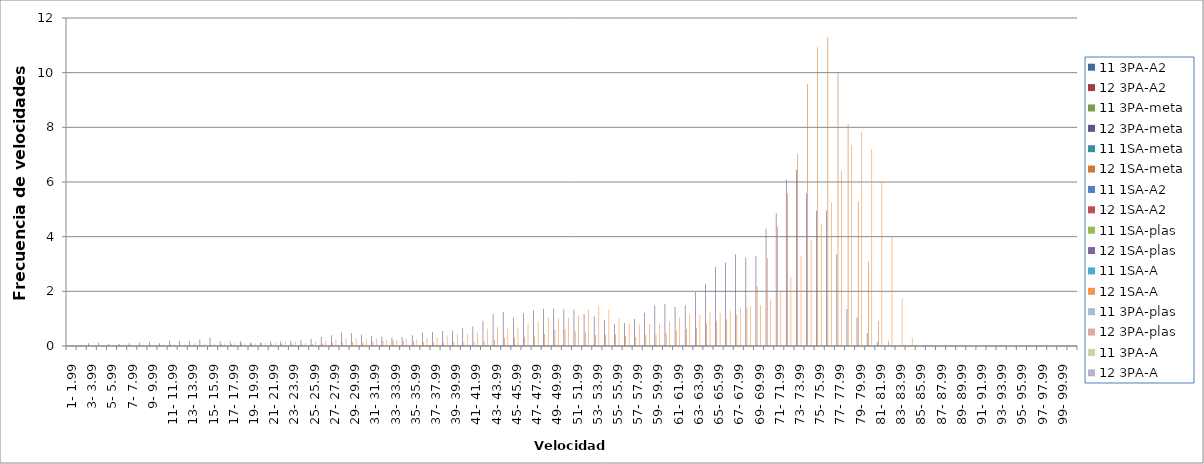
| Category | 11 3PA-A2 | 12 3PA-A2 | 11 3PA-meta | 12 3PA-meta | 11 1SA-meta | 12 1SA-meta | 11 1SA-A2 | 12 1SA-A2 | 11 1SA-plas | 12 1SA-plas | 11 1SA-A | 12 1SA-A | 11 3PA-plas | 12 3PA-plas | 11 3PA-A | 12 3PA-A |
|---|---|---|---|---|---|---|---|---|---|---|---|---|---|---|---|---|
|  1- 1.99 | 0 | 0 | 0 | 0.005 | 0 | 0.03 | 0 | 0 | 0 | 0 | 0 | 0.045 | 0 | 0 | 0 | 0 |
|  2- 2.99 | 0 | 0 | 0 | 0.02 | 0 | 0.01 | 0 | 0 | 0 | 0 | 0 | 0.005 | 0 | 0 | 0 | 0 |
|  3- 3.99 | 0 | 0 | 0 | 0.105 | 0 | 0 | 0 | 0 | 0 | 0 | 0 | 0.02 | 0 | 0 | 0 | 0 |
|  4- 4.99 | 0 | 0 | 0 | 0.13 | 0 | 0 | 0 | 0 | 0 | 0 | 0 | 0.025 | 0 | 0 | 0 | 0 |
|  5- 5.99 | 0 | 0 | 0 | 0.085 | 0 | 0.01 | 0 | 0 | 0 | 0 | 0 | 0.05 | 0 | 0 | 0 | 0 |
|  6- 6.99 | 0 | 0 | 0 | 0.085 | 0 | 0.015 | 0 | 0 | 0 | 0 | 0 | 0.055 | 0 | 0 | 0 | 0 |
|  7- 7.99 | 0 | 0 | 0 | 0.1 | 0 | 0.015 | 0 | 0 | 0 | 0 | 0 | 0.025 | 0 | 0 | 0 | 0 |
|  8- 8.99 | 0 | 0 | 0 | 0.13 | 0 | 0.025 | 0 | 0 | 0 | 0 | 0 | 0.04 | 0 | 0 | 0 | 0 |
|  9- 9.99 | 0 | 0 | 0 | 0.145 | 0 | 0.025 | 0 | 0 | 0 | 0 | 0 | 0.045 | 0 | 0 | 0 | 0 |
|  10- 10.99 | 0 | 0 | 0 | 0.105 | 0 | 0.03 | 0 | 0 | 0 | 0 | 0 | 0.055 | 0 | 0 | 0 | 0 |
|  11- 11.99 | 0 | 0 | 0 | 0.195 | 0 | 0.05 | 0 | 0 | 0 | 0 | 0 | 0.045 | 0 | 0 | 0 | 0 |
|  12- 12.99 | 0 | 0 | 0 | 0.185 | 0 | 0.02 | 0 | 0 | 0 | 0 | 0 | 0.05 | 0 | 0 | 0 | 0 |
|  13- 13.99 | 0 | 0 | 0 | 0.185 | 0 | 0.025 | 0 | 0 | 0 | 0 | 0 | 0.09 | 0 | 0 | 0 | 0 |
|  14- 14.99 | 0 | 0 | 0 | 0.235 | 0 | 0.035 | 0 | 0 | 0 | 0 | 0 | 0.09 | 0 | 0 | 0 | 0 |
|  15- 15.99 | 0 | 0 | 0 | 0.3 | 0 | 0.05 | 0 | 0 | 0 | 0 | 0 | 0.085 | 0 | 0 | 0 | 0 |
|  16- 16.99 | 0 | 0 | 0 | 0.18 | 0 | 0.06 | 0 | 0 | 0 | 0 | 0 | 0.095 | 0 | 0 | 0 | 0 |
|  17- 17.99 | 0 | 0 | 0 | 0.165 | 0 | 0.065 | 0 | 0 | 0 | 0 | 0 | 0.11 | 0 | 0 | 0 | 0 |
|  18- 18.99 | 0 | 0 | 0 | 0.17 | 0 | 0.1 | 0 | 0 | 0 | 0 | 0 | 0.095 | 0 | 0 | 0 | 0 |
|  19- 19.99 | 0 | 0 | 0 | 0.115 | 0 | 0.09 | 0 | 0 | 0 | 0 | 0 | 0.095 | 0 | 0 | 0 | 0 |
|  20- 20.99 | 0 | 0 | 0 | 0.13 | 0 | 0.105 | 0 | 0 | 0 | 0 | 0 | 0.11 | 0 | 0 | 0 | 0 |
|  21- 21.99 | 0 | 0 | 0 | 0.165 | 0 | 0.08 | 0 | 0 | 0 | 0 | 0 | 0.125 | 0 | 0 | 0 | 0 |
|  22- 22.99 | 0 | 0 | 0 | 0.17 | 0 | 0.08 | 0 | 0 | 0 | 0 | 0 | 0.15 | 0 | 0 | 0 | 0 |
|  23- 23.99 | 0 | 0 | 0 | 0.19 | 0 | 0.08 | 0 | 0 | 0 | 0 | 0 | 0.145 | 0 | 0 | 0 | 0 |
|  24- 24.99 | 0 | 0 | 0 | 0.225 | 0 | 0.065 | 0 | 0 | 0 | 0 | 0 | 0.12 | 0 | 0 | 0 | 0 |
|  25- 25.99 | 0 | 0 | 0 | 0.265 | 0 | 0.07 | 0 | 0 | 0 | 0 | 0 | 0.155 | 0 | 0 | 0 | 0 |
|  26- 26.99 | 0 | 0 | 0 | 0.325 | 0 | 0.095 | 0 | 0 | 0 | 0 | 0 | 0.205 | 0 | 0 | 0 | 0 |
|  27- 27.99 | 0 | 0 | 0 | 0.395 | 0 | 0.115 | 0 | 0 | 0 | 0 | 0 | 0.235 | 0 | 0 | 0 | 0 |
|  28- 28.99 | 0 | 0 | 0 | 0.49 | 0 | 0.13 | 0 | 0 | 0 | 0 | 0 | 0.265 | 0 | 0 | 0 | 0 |
|  29- 29.99 | 0 | 0 | 0 | 0.475 | 0 | 0.145 | 0 | 0 | 0 | 0 | 0 | 0.275 | 0 | 0 | 0 | 0 |
|  30- 30.99 | 0 | 0 | 0 | 0.415 | 0 | 0.125 | 0 | 0 | 0 | 0 | 0 | 0.27 | 0 | 0 | 0 | 0 |
|  31- 31.99 | 0 | 0 | 0 | 0.375 | 0 | 0.16 | 0 | 0 | 0 | 0 | 0 | 0.265 | 0 | 0 | 0 | 0 |
|  32- 32.99 | 0 | 0 | 0 | 0.34 | 0 | 0.19 | 0 | 0 | 0 | 0 | 0 | 0.225 | 0 | 0 | 0 | 0 |
|  33- 33.99 | 0 | 0 | 0 | 0.315 | 0 | 0.205 | 0 | 0 | 0 | 0 | 0 | 0.225 | 0 | 0 | 0 | 0 |
|  34- 34.99 | 0 | 0 | 0 | 0.325 | 0 | 0.19 | 0 | 0 | 0 | 0 | 0 | 0.265 | 0 | 0 | 0 | 0 |
|  35- 35.99 | 0 | 0 | 0 | 0.395 | 0 | 0.17 | 0 | 0 | 0 | 0 | 0 | 0.245 | 0 | 0 | 0 | 0 |
|  36- 36.99 | 0 | 0 | 0 | 0.495 | 0 | 0.135 | 0 | 0 | 0 | 0 | 0 | 0.3 | 0 | 0 | 0 | 0 |
|  37- 37.99 | 0 | 0 | 0 | 0.515 | 0 | 0.13 | 0 | 0 | 0 | 0 | 0 | 0.315 | 0 | 0 | 0 | 0 |
|  38- 38.99 | 0 | 0 | 0 | 0.545 | 0 | 0.13 | 0 | 0 | 0 | 0 | 0 | 0.38 | 0 | 0 | 0 | 0 |
|  39- 39.99 | 0 | 0 | 0 | 0.555 | 0 | 0.15 | 0 | 0 | 0 | 0 | 0 | 0.435 | 0 | 0 | 0 | 0 |
|  40- 40.99 | 0 | 0 | 0 | 0.655 | 0 | 0.14 | 0 | 0 | 0 | 0 | 0 | 0.44 | 0 | 0 | 0 | 0 |
|  41- 41.99 | 0 | 0 | 0 | 0.71 | 0 | 0.15 | 0 | 0 | 0 | 0 | 0 | 0.495 | 0 | 0 | 0 | 0 |
|  42- 42.99 | 0 | 0 | 0 | 0.925 | 0 | 0.155 | 0 | 0 | 0 | 0 | 0 | 0.635 | 0 | 0 | 0 | 0 |
|  43- 43.99 | 0 | 0 | 0 | 1.175 | 0 | 0.23 | 0 | 0 | 0 | 0 | 0 | 0.695 | 0 | 0 | 0 | 0 |
|  44- 44.99 | 0 | 0 | 0 | 1.25 | 0 | 0.305 | 0 | 0 | 0 | 0 | 0 | 0.64 | 0 | 0 | 0 | 0 |
|  45- 45.99 | 0 | 0 | 0 | 1.04 | 0 | 0.32 | 0 | 0 | 0 | 0 | 0 | 0.69 | 0 | 0 | 0 | 0 |
|  46- 46.99 | 0 | 0 | 0 | 1.195 | 0 | 0.34 | 0 | 0 | 0 | 0 | 0 | 0.81 | 0 | 0 | 0 | 0 |
|  47- 47.99 | 0 | 0 | 0 | 1.305 | 0 | 0.345 | 0 | 0 | 0 | 0 | 0 | 0.905 | 0 | 0 | 0 | 0 |
|  48- 48.99 | 0 | 0 | 0 | 1.365 | 0 | 0.44 | 0 | 0 | 0 | 0 | 0 | 1.03 | 0 | 0 | 0 | 0 |
|  49- 49.99 | 0 | 0 | 0 | 1.365 | 0 | 0.59 | 0 | 0 | 0 | 0 | 0 | 1.025 | 0 | 0 | 0 | 0 |
|  50- 50.99 | 0 | 0 | 0 | 1.34 | 0 | 0.62 | 0 | 0 | 0 | 0 | 0 | 1.02 | 0 | 0 | 0 | 0 |
|  51- 51.99 | 0 | 0 | 0 | 1.33 | 0 | 0.54 | 0 | 0 | 0 | 0 | 0 | 1.115 | 0 | 0 | 0 | 0 |
|  52- 52.99 | 0 | 0 | 0 | 1.175 | 0 | 0.495 | 0 | 0 | 0 | 0 | 0 | 1.335 | 0 | 0 | 0 | 0 |
|  53- 53.99 | 0 | 0 | 0 | 1.08 | 0 | 0.405 | 0 | 0 | 0 | 0 | 0 | 1.46 | 0 | 0 | 0 | 0 |
|  54- 54.99 | 0 | 0 | 0 | 0.94 | 0 | 0.4 | 0 | 0 | 0 | 0 | 0 | 1.33 | 0 | 0 | 0 | 0 |
|  55- 55.99 | 0 | 0 | 0 | 0.805 | 0 | 0.43 | 0 | 0 | 0 | 0 | 0 | 0.995 | 0 | 0 | 0 | 0 |
|  56- 56.99 | 0 | 0 | 0 | 0.845 | 0 | 0.365 | 0 | 0 | 0 | 0 | 0 | 0.82 | 0 | 0 | 0 | 0 |
|  57- 57.99 | 0 | 0 | 0 | 0.985 | 0 | 0.33 | 0 | 0 | 0 | 0 | 0 | 0.79 | 0 | 0 | 0 | 0 |
|  58- 58.99 | 0 | 0 | 0 | 1.215 | 0 | 0.4 | 0 | 0 | 0 | 0 | 0 | 0.805 | 0 | 0 | 0 | 0 |
|  59- 59.99 | 0 | 0 | 0 | 1.48 | 0 | 0.41 | 0 | 0 | 0 | 0 | 0 | 0.83 | 0 | 0 | 0 | 0 |
|  60- 60.99 | 0 | 0 | 0 | 1.535 | 0 | 0.475 | 0 | 0 | 0 | 0 | 0 | 0.9 | 0 | 0 | 0 | 0 |
|  61- 61.99 | 0 | 0 | 0 | 1.43 | 0 | 0.565 | 0 | 0 | 0 | 0 | 0 | 1.04 | 0 | 0 | 0 | 0 |
|  62- 62.99 | 0 | 0 | 0 | 1.49 | 0 | 0.625 | 0 | 0 | 0 | 0 | 0 | 1.155 | 0 | 0 | 0 | 0 |
|  63- 63.99 | 0 | 0 | 0 | 1.98 | 0 | 0.665 | 0 | 0 | 0 | 0 | 0 | 1.165 | 0 | 0 | 0 | 0 |
|  64- 64.99 | 0 | 0 | 0 | 2.265 | 0 | 0.83 | 0 | 0 | 0 | 0 | 0 | 1.225 | 0 | 0 | 0 | 0 |
|  65- 65.99 | 0 | 0 | 0 | 2.89 | 0 | 0.925 | 0 | 0 | 0 | 0 | 0 | 1.23 | 0 | 0 | 0 | 0 |
|  66- 66.99 | 0 | 0 | 0 | 3.055 | 0 | 0.965 | 0 | 0 | 0 | 0 | 0 | 1.28 | 0 | 0 | 0 | 0 |
|  67- 67.99 | 0 | 0 | 0 | 3.355 | 0 | 1.14 | 0 | 0 | 0 | 0 | 0 | 1.38 | 0 | 0 | 0 | 0 |
|  68- 68.99 | 0 | 0 | 0 | 3.24 | 0 | 1.405 | 0 | 0 | 0 | 0 | 0 | 1.455 | 0 | 0 | 0 | 0 |
|  69- 69.99 | 0 | 0 | 0 | 3.3 | 0 | 2.175 | 0 | 0 | 0 | 0 | 0 | 1.485 | 0 | 0 | 0 | 0 |
|  70- 70.99 | 0 | 0 | 0 | 4.29 | 0 | 3.215 | 0 | 0 | 0 | 0 | 0 | 1.705 | 0 | 0 | 0 | 0 |
|  71- 71.99 | 0 | 0 | 0 | 4.845 | 0 | 4.36 | 0 | 0 | 0 | 0 | 0 | 1.985 | 0 | 0 | 0 | 0 |
|  72- 72.99 | 0 | 0 | 0 | 6.095 | 0 | 5.57 | 0 | 0 | 0 | 0 | 0 | 2.535 | 0 | 0 | 0 | 0 |
|  73- 73.99 | 0 | 0 | 0 | 6.445 | 0 | 7.025 | 0 | 0 | 0 | 0 | 0 | 3.295 | 0 | 0 | 0 | 0 |
|  74- 74.99 | 0 | 0 | 0 | 5.59 | 0 | 9.58 | 0 | 0 | 0 | 0 | 0 | 3.875 | 0 | 0 | 0 | 0 |
|  75- 75.99 | 0 | 0 | 0 | 4.945 | 0 | 10.93 | 0 | 0 | 0 | 0 | 0 | 4.475 | 0 | 0 | 0 | 0 |
|  76- 76.99 | 0 | 0 | 0 | 4.96 | 0 | 11.3 | 0 | 0 | 0 | 0 | 0 | 5.26 | 0 | 0 | 0 | 0 |
|  77- 77.99 | 0 | 0 | 0 | 3.35 | 0 | 10.01 | 0 | 0 | 0 | 0 | 0 | 6.405 | 0 | 0 | 0 | 0 |
|  78- 78.99 | 0 | 0 | 0 | 1.35 | 0 | 8.125 | 0 | 0 | 0 | 0 | 0 | 7.355 | 0 | 0 | 0 | 0 |
|  79- 79.99 | 0 | 0 | 0 | 1.04 | 0 | 5.3 | 0 | 0 | 0 | 0 | 0 | 7.83 | 0 | 0 | 0 | 0 |
|  80- 80.99 | 0 | 0 | 0 | 0.475 | 0 | 3.08 | 0 | 0 | 0 | 0 | 0 | 7.2 | 0 | 0 | 0 | 0 |
|  81- 81.99 | 0 | 0 | 0 | 0.135 | 0 | 0.915 | 0 | 0 | 0 | 0 | 0 | 5.995 | 0 | 0 | 0 | 0 |
|  82- 82.99 | 0 | 0 | 0 | 0.005 | 0 | 0.19 | 0 | 0 | 0 | 0 | 0 | 4 | 0 | 0 | 0 | 0 |
|  83- 83.99 | 0 | 0 | 0 | 0 | 0 | 0.025 | 0 | 0 | 0 | 0 | 0 | 1.735 | 0 | 0 | 0 | 0 |
|  84- 84.99 | 0 | 0 | 0 | 0 | 0 | 0 | 0 | 0 | 0 | 0 | 0 | 0.31 | 0 | 0 | 0 | 0 |
|  85- 85.99 | 0 | 0 | 0 | 0 | 0 | 0 | 0 | 0 | 0 | 0 | 0 | 0.005 | 0 | 0 | 0 | 0 |
|  86- 86.99 | 0 | 0 | 0 | 0 | 0 | 0 | 0 | 0 | 0 | 0 | 0 | 0 | 0 | 0 | 0 | 0 |
|  87- 87.99 | 0 | 0 | 0 | 0 | 0 | 0 | 0 | 0 | 0 | 0 | 0 | 0 | 0 | 0 | 0 | 0 |
|  88- 88.99 | 0 | 0 | 0 | 0 | 0 | 0 | 0 | 0 | 0 | 0 | 0 | 0 | 0 | 0 | 0 | 0 |
|  89- 89.99 | 0 | 0 | 0 | 0 | 0 | 0 | 0 | 0 | 0 | 0 | 0 | 0 | 0 | 0 | 0 | 0 |
|  90- 90.99 | 0 | 0 | 0 | 0 | 0 | 0 | 0 | 0 | 0 | 0 | 0 | 0 | 0 | 0 | 0 | 0 |
|  91- 91.99 | 0 | 0 | 0 | 0 | 0 | 0 | 0 | 0 | 0 | 0 | 0 | 0 | 0 | 0 | 0 | 0 |
|  92- 92.99 | 0 | 0 | 0 | 0 | 0 | 0 | 0 | 0 | 0 | 0 | 0 | 0 | 0 | 0 | 0 | 0 |
|  93- 93.99 | 0 | 0 | 0 | 0 | 0 | 0 | 0 | 0 | 0 | 0 | 0 | 0 | 0 | 0 | 0 | 0 |
|  94- 94.99 | 0 | 0 | 0 | 0 | 0 | 0 | 0 | 0 | 0 | 0 | 0 | 0 | 0 | 0 | 0 | 0 |
|  95- 95.99 | 0 | 0 | 0 | 0 | 0 | 0 | 0 | 0 | 0 | 0 | 0 | 0 | 0 | 0 | 0 | 0 |
|  96- 96.99 | 0 | 0 | 0 | 0 | 0 | 0 | 0 | 0 | 0 | 0 | 0 | 0 | 0 | 0 | 0 | 0 |
|  97- 97.99 | 0 | 0 | 0 | 0 | 0 | 0 | 0 | 0 | 0 | 0 | 0 | 0 | 0 | 0 | 0 | 0 |
|  98- 98.99 | 0 | 0 | 0 | 0 | 0 | 0 | 0 | 0 | 0 | 0 | 0 | 0 | 0 | 0 | 0 | 0 |
|  99- 99.99 | 0 | 0 | 0 | 0 | 0 | 0 | 0 | 0 | 0 | 0 | 0 | 0 | 0 | 0 | 0 | 0 |
|  100- 42 | 0 | 0 | 0 | 0 | 0 | 0 | 0 | 0 | 0 | 0 | 0 | 0 | 0 | 0 | 0 | 0 |